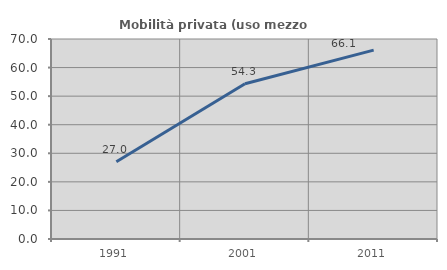
| Category | Mobilità privata (uso mezzo privato) |
|---|---|
| 1991.0 | 27.007 |
| 2001.0 | 54.331 |
| 2011.0 | 66.111 |